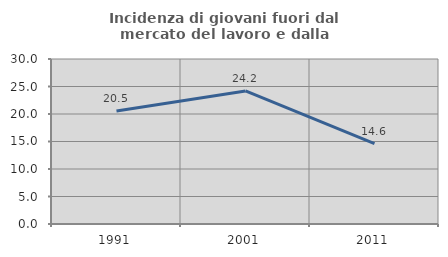
| Category | Incidenza di giovani fuori dal mercato del lavoro e dalla formazione  |
|---|---|
| 1991.0 | 20.534 |
| 2001.0 | 24.201 |
| 2011.0 | 14.613 |